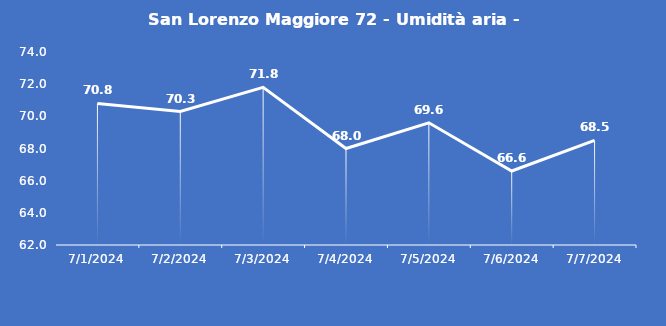
| Category | San Lorenzo Maggiore 72 - Umidità aria - Grezzo (%) |
|---|---|
| 7/1/24 | 70.8 |
| 7/2/24 | 70.3 |
| 7/3/24 | 71.8 |
| 7/4/24 | 68 |
| 7/5/24 | 69.6 |
| 7/6/24 | 66.6 |
| 7/7/24 | 68.5 |